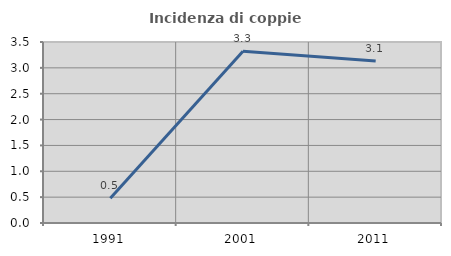
| Category | Incidenza di coppie miste |
|---|---|
| 1991.0 | 0.48 |
| 2001.0 | 3.319 |
| 2011.0 | 3.131 |